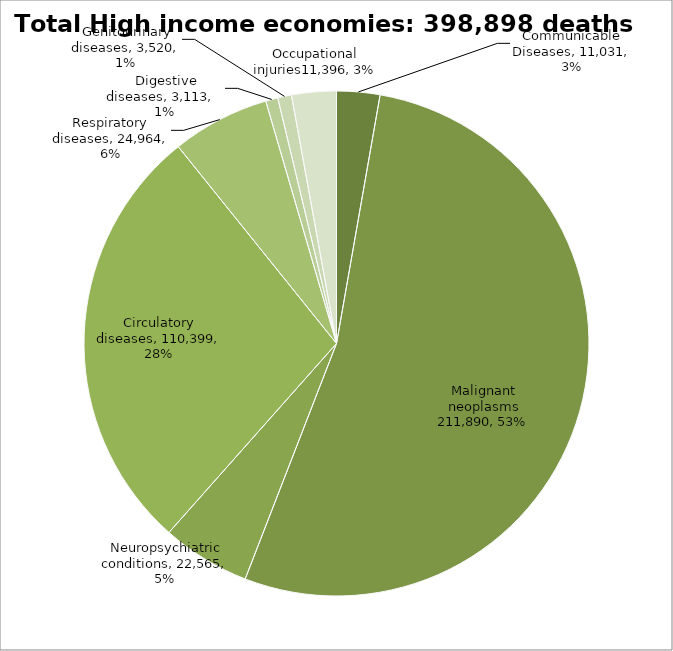
| Category | Series 0 |
|---|---|
| Communicable Diseases | 11031.203 |
| Malignant neoplasms | 211890.261 |
| Neuropsychiatric conditions | 22564.581 |
| Circulatory diseases | 110398.905 |
| Respiratory diseases | 24964.254 |
| Digestive diseases | 3112.701 |
| Genitourinary diseases | 3520.451 |
| Occupational injuries | 11396 |